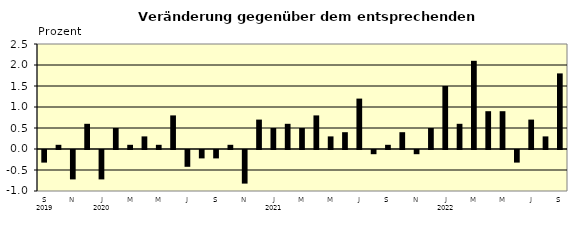
| Category | Series 0 |
|---|---|
| 0 | -0.3 |
| 1 | 0.1 |
| 2 | -0.7 |
| 3 | 0.6 |
| 4 | -0.7 |
| 5 | 0.5 |
| 6 | 0.1 |
| 7 | 0.3 |
| 8 | 0.1 |
| 9 | 0.8 |
| 10 | -0.4 |
| 11 | -0.2 |
| 12 | -0.2 |
| 13 | 0.1 |
| 14 | -0.8 |
| 15 | 0.7 |
| 16 | 0.5 |
| 17 | 0.6 |
| 18 | 0.5 |
| 19 | 0.8 |
| 20 | 0.3 |
| 21 | 0.4 |
| 22 | 1.2 |
| 23 | -0.1 |
| 24 | 0.1 |
| 25 | 0.4 |
| 26 | -0.1 |
| 27 | 0.5 |
| 28 | 1.5 |
| 29 | 0.6 |
| 30 | 2.1 |
| 31 | 0.9 |
| 32 | 0.9 |
| 33 | -0.3 |
| 34 | 0.7 |
| 35 | 0.3 |
| 36 | 1.8 |